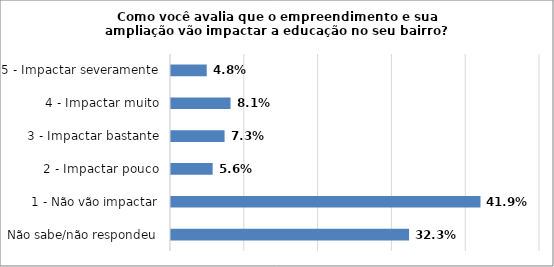
| Category | Series 0 |
|---|---|
| Não sabe/não respondeu | 0.323 |
| 1 - Não vão impactar | 0.419 |
| 2 - Impactar pouco | 0.056 |
| 3 - Impactar bastante | 0.073 |
| 4 - Impactar muito | 0.081 |
| 5 - Impactar severamente | 0.048 |